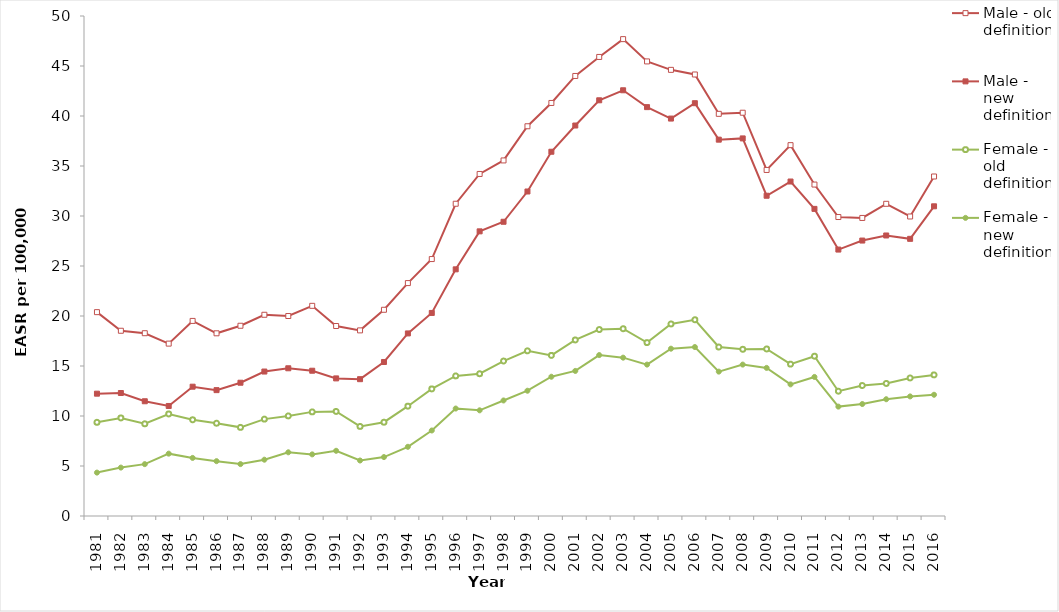
| Category | Male - old definition | Male - new definition | Female - old definition | Female - new definition |
|---|---|---|---|---|
| 1981.0 | 20.385 | 12.232 | 9.369 | 4.34 |
| 1982.0 | 18.524 | 12.299 | 9.805 | 4.841 |
| 1983.0 | 18.279 | 11.474 | 9.222 | 5.186 |
| 1984.0 | 17.238 | 11.003 | 10.204 | 6.235 |
| 1985.0 | 19.509 | 12.93 | 9.62 | 5.808 |
| 1986.0 | 18.27 | 12.587 | 9.279 | 5.484 |
| 1987.0 | 19.025 | 13.328 | 8.865 | 5.189 |
| 1988.0 | 20.123 | 14.446 | 9.688 | 5.63 |
| 1989.0 | 19.999 | 14.772 | 10.009 | 6.37 |
| 1990.0 | 21.016 | 14.528 | 10.412 | 6.163 |
| 1991.0 | 19 | 13.76 | 10.455 | 6.521 |
| 1992.0 | 18.562 | 13.681 | 8.959 | 5.55 |
| 1993.0 | 20.623 | 15.401 | 9.381 | 5.893 |
| 1994.0 | 23.292 | 18.257 | 10.98 | 6.92 |
| 1995.0 | 25.695 | 20.305 | 12.708 | 8.551 |
| 1996.0 | 31.226 | 24.667 | 14.01 | 10.746 |
| 1997.0 | 34.204 | 28.465 | 14.228 | 10.568 |
| 1998.0 | 35.557 | 29.423 | 15.496 | 11.554 |
| 1999.0 | 38.975 | 32.45 | 16.518 | 12.527 |
| 2000.0 | 41.303 | 36.426 | 16.059 | 13.926 |
| 2001.0 | 44.004 | 39.048 | 17.606 | 14.507 |
| 2002.0 | 45.905 | 41.571 | 18.646 | 16.093 |
| 2003.0 | 47.686 | 42.573 | 18.727 | 15.834 |
| 2004.0 | 45.459 | 40.887 | 17.341 | 15.141 |
| 2005.0 | 44.615 | 39.744 | 19.204 | 16.731 |
| 2006.0 | 44.151 | 41.28 | 19.623 | 16.897 |
| 2007.0 | 40.217 | 37.634 | 16.899 | 14.438 |
| 2008.0 | 40.328 | 37.759 | 16.671 | 15.141 |
| 2009.0 | 34.604 | 32.026 | 16.703 | 14.81 |
| 2010.0 | 37.085 | 33.447 | 15.186 | 13.162 |
| 2011.0 | 33.145 | 30.712 | 15.981 | 13.906 |
| 2012.0 | 29.898 | 26.642 | 12.48 | 10.939 |
| 2013.0 | 29.805 | 27.545 | 13.047 | 11.197 |
| 2014.0 | 31.22 | 28.052 | 13.255 | 11.677 |
| 2015.0 | 29.951 | 27.716 | 13.805 | 11.958 |
| 2016.0 | 33.952 | 30.97 | 14.11 | 12.124 |